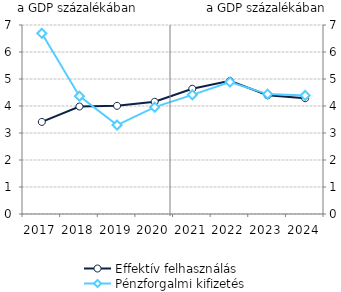
| Category | Effektív felhasználás |
|---|---|
| 2017.0 | 3.41 |
| 2018.0 | 3.982 |
| 2019.0 | 4.006 |
| 2020.0 | 4.156 |
| 2021.0 | 4.639 |
| 2022.0 | 4.93 |
| 2023.0 | 4.399 |
| 2024.0 | 4.289 |